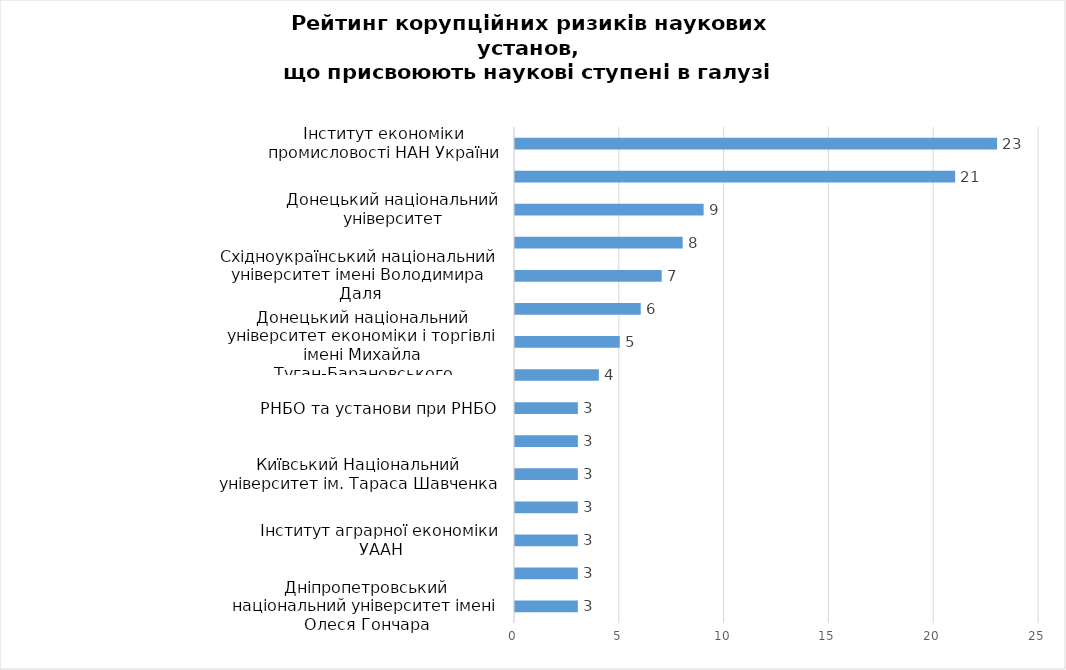
| Category | Кількість балів |
|---|---|
| Дніпропетровський національний університет імені Олеся Гончара | 3 |
| Донецький державний університет управління | 3 |
| Інститут аграрної економіки УААН | 3 |
| Інститут регіональних досліджень НАН України | 3 |
| Київський Національний університет ім. Тараса Шавченка | 3 |
| Національна академія державного управління при Президентові України | 3 |
| РНБО та установи при РНБО | 3 |
| Інститут економіки НАН України | 4 |
| Донецький національний університет економіки і торгівлі імені Михайла Туган-Барановського | 5 |
| Рада по  вивченню продуктивних сил України НАН України | 6 |
| Східноукраїнський національний університет імені Володимира Даля | 7 |
| Інститут економіки та прогнозування НАН України | 8 |
| Донецький національний університет | 9 |
| Київський національний економічний університет ім. В.Гетьмана | 21 |
| Інститут економіки промисловості НАН України | 23 |